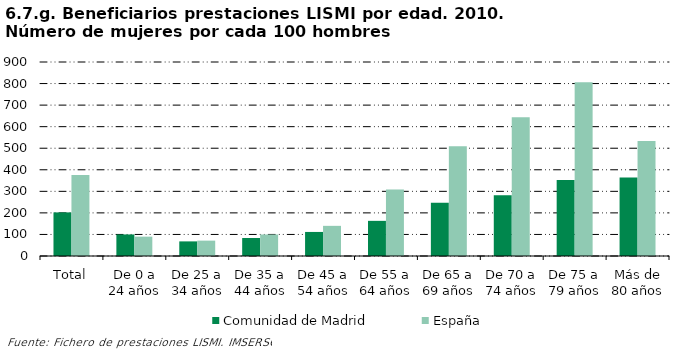
| Category | Comunidad de Madrid | España |
|---|---|---|
| Total | 202.27 | 375.735 |
| De 0 a 24 años | 100 | 89.726 |
| De 25 a 34 años | 67.797 | 71.296 |
| De 35 a 44 años | 83.594 | 99.877 |
| De 45 a 54 años | 111.602 | 139.911 |
| De 55 a 64 años | 163.068 | 308.735 |
| De 65 a 69 años | 246.753 | 509.367 |
| De 70 a 74 años | 281.609 | 643.443 |
| De 75 a 79 años | 352.128 | 806.56 |
| Más de 80 años | 364.189 | 533.454 |